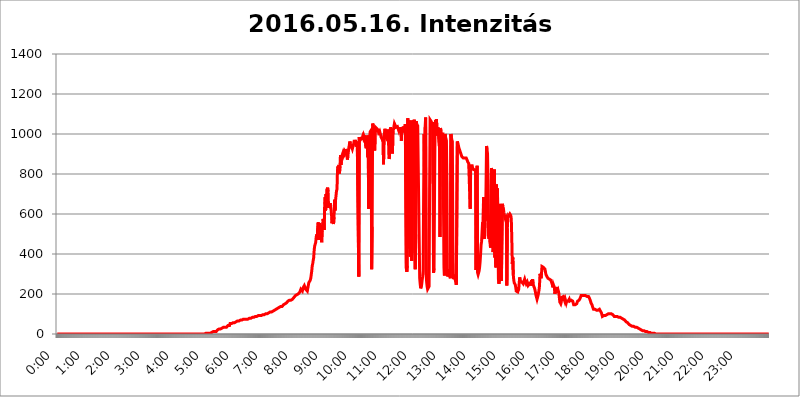
| Category | 2016.05.16. Intenzitás [W/m^2] |
|---|---|
| 0.0 | 0 |
| 0.0006944444444444445 | 0 |
| 0.001388888888888889 | 0 |
| 0.0020833333333333333 | 0 |
| 0.002777777777777778 | 0 |
| 0.003472222222222222 | 0 |
| 0.004166666666666667 | 0 |
| 0.004861111111111111 | 0 |
| 0.005555555555555556 | 0 |
| 0.0062499999999999995 | 0 |
| 0.006944444444444444 | 0 |
| 0.007638888888888889 | 0 |
| 0.008333333333333333 | 0 |
| 0.009027777777777779 | 0 |
| 0.009722222222222222 | 0 |
| 0.010416666666666666 | 0 |
| 0.011111111111111112 | 0 |
| 0.011805555555555555 | 0 |
| 0.012499999999999999 | 0 |
| 0.013194444444444444 | 0 |
| 0.013888888888888888 | 0 |
| 0.014583333333333332 | 0 |
| 0.015277777777777777 | 0 |
| 0.015972222222222224 | 0 |
| 0.016666666666666666 | 0 |
| 0.017361111111111112 | 0 |
| 0.018055555555555557 | 0 |
| 0.01875 | 0 |
| 0.019444444444444445 | 0 |
| 0.02013888888888889 | 0 |
| 0.020833333333333332 | 0 |
| 0.02152777777777778 | 0 |
| 0.022222222222222223 | 0 |
| 0.02291666666666667 | 0 |
| 0.02361111111111111 | 0 |
| 0.024305555555555556 | 0 |
| 0.024999999999999998 | 0 |
| 0.025694444444444447 | 0 |
| 0.02638888888888889 | 0 |
| 0.027083333333333334 | 0 |
| 0.027777777777777776 | 0 |
| 0.02847222222222222 | 0 |
| 0.029166666666666664 | 0 |
| 0.029861111111111113 | 0 |
| 0.030555555555555555 | 0 |
| 0.03125 | 0 |
| 0.03194444444444445 | 0 |
| 0.03263888888888889 | 0 |
| 0.03333333333333333 | 0 |
| 0.034027777777777775 | 0 |
| 0.034722222222222224 | 0 |
| 0.035416666666666666 | 0 |
| 0.036111111111111115 | 0 |
| 0.03680555555555556 | 0 |
| 0.0375 | 0 |
| 0.03819444444444444 | 0 |
| 0.03888888888888889 | 0 |
| 0.03958333333333333 | 0 |
| 0.04027777777777778 | 0 |
| 0.04097222222222222 | 0 |
| 0.041666666666666664 | 0 |
| 0.042361111111111106 | 0 |
| 0.04305555555555556 | 0 |
| 0.043750000000000004 | 0 |
| 0.044444444444444446 | 0 |
| 0.04513888888888889 | 0 |
| 0.04583333333333334 | 0 |
| 0.04652777777777778 | 0 |
| 0.04722222222222222 | 0 |
| 0.04791666666666666 | 0 |
| 0.04861111111111111 | 0 |
| 0.049305555555555554 | 0 |
| 0.049999999999999996 | 0 |
| 0.05069444444444445 | 0 |
| 0.051388888888888894 | 0 |
| 0.052083333333333336 | 0 |
| 0.05277777777777778 | 0 |
| 0.05347222222222222 | 0 |
| 0.05416666666666667 | 0 |
| 0.05486111111111111 | 0 |
| 0.05555555555555555 | 0 |
| 0.05625 | 0 |
| 0.05694444444444444 | 0 |
| 0.057638888888888885 | 0 |
| 0.05833333333333333 | 0 |
| 0.05902777777777778 | 0 |
| 0.059722222222222225 | 0 |
| 0.06041666666666667 | 0 |
| 0.061111111111111116 | 0 |
| 0.06180555555555556 | 0 |
| 0.0625 | 0 |
| 0.06319444444444444 | 0 |
| 0.06388888888888888 | 0 |
| 0.06458333333333334 | 0 |
| 0.06527777777777778 | 0 |
| 0.06597222222222222 | 0 |
| 0.06666666666666667 | 0 |
| 0.06736111111111111 | 0 |
| 0.06805555555555555 | 0 |
| 0.06874999999999999 | 0 |
| 0.06944444444444443 | 0 |
| 0.07013888888888889 | 0 |
| 0.07083333333333333 | 0 |
| 0.07152777777777779 | 0 |
| 0.07222222222222223 | 0 |
| 0.07291666666666667 | 0 |
| 0.07361111111111111 | 0 |
| 0.07430555555555556 | 0 |
| 0.075 | 0 |
| 0.07569444444444444 | 0 |
| 0.0763888888888889 | 0 |
| 0.07708333333333334 | 0 |
| 0.07777777777777778 | 0 |
| 0.07847222222222222 | 0 |
| 0.07916666666666666 | 0 |
| 0.0798611111111111 | 0 |
| 0.08055555555555556 | 0 |
| 0.08125 | 0 |
| 0.08194444444444444 | 0 |
| 0.08263888888888889 | 0 |
| 0.08333333333333333 | 0 |
| 0.08402777777777777 | 0 |
| 0.08472222222222221 | 0 |
| 0.08541666666666665 | 0 |
| 0.08611111111111112 | 0 |
| 0.08680555555555557 | 0 |
| 0.08750000000000001 | 0 |
| 0.08819444444444445 | 0 |
| 0.08888888888888889 | 0 |
| 0.08958333333333333 | 0 |
| 0.09027777777777778 | 0 |
| 0.09097222222222222 | 0 |
| 0.09166666666666667 | 0 |
| 0.09236111111111112 | 0 |
| 0.09305555555555556 | 0 |
| 0.09375 | 0 |
| 0.09444444444444444 | 0 |
| 0.09513888888888888 | 0 |
| 0.09583333333333333 | 0 |
| 0.09652777777777777 | 0 |
| 0.09722222222222222 | 0 |
| 0.09791666666666667 | 0 |
| 0.09861111111111111 | 0 |
| 0.09930555555555555 | 0 |
| 0.09999999999999999 | 0 |
| 0.10069444444444443 | 0 |
| 0.1013888888888889 | 0 |
| 0.10208333333333335 | 0 |
| 0.10277777777777779 | 0 |
| 0.10347222222222223 | 0 |
| 0.10416666666666667 | 0 |
| 0.10486111111111111 | 0 |
| 0.10555555555555556 | 0 |
| 0.10625 | 0 |
| 0.10694444444444444 | 0 |
| 0.1076388888888889 | 0 |
| 0.10833333333333334 | 0 |
| 0.10902777777777778 | 0 |
| 0.10972222222222222 | 0 |
| 0.1111111111111111 | 0 |
| 0.11180555555555556 | 0 |
| 0.11180555555555556 | 0 |
| 0.1125 | 0 |
| 0.11319444444444444 | 0 |
| 0.11388888888888889 | 0 |
| 0.11458333333333333 | 0 |
| 0.11527777777777777 | 0 |
| 0.11597222222222221 | 0 |
| 0.11666666666666665 | 0 |
| 0.1173611111111111 | 0 |
| 0.11805555555555557 | 0 |
| 0.11944444444444445 | 0 |
| 0.12013888888888889 | 0 |
| 0.12083333333333333 | 0 |
| 0.12152777777777778 | 0 |
| 0.12222222222222223 | 0 |
| 0.12291666666666667 | 0 |
| 0.12291666666666667 | 0 |
| 0.12361111111111112 | 0 |
| 0.12430555555555556 | 0 |
| 0.125 | 0 |
| 0.12569444444444444 | 0 |
| 0.12638888888888888 | 0 |
| 0.12708333333333333 | 0 |
| 0.16875 | 0 |
| 0.12847222222222224 | 0 |
| 0.12916666666666668 | 0 |
| 0.12986111111111112 | 0 |
| 0.13055555555555556 | 0 |
| 0.13125 | 0 |
| 0.13194444444444445 | 0 |
| 0.1326388888888889 | 0 |
| 0.13333333333333333 | 0 |
| 0.13402777777777777 | 0 |
| 0.13402777777777777 | 0 |
| 0.13472222222222222 | 0 |
| 0.13541666666666666 | 0 |
| 0.1361111111111111 | 0 |
| 0.13749999999999998 | 0 |
| 0.13819444444444443 | 0 |
| 0.1388888888888889 | 0 |
| 0.13958333333333334 | 0 |
| 0.14027777777777778 | 0 |
| 0.14097222222222222 | 0 |
| 0.14166666666666666 | 0 |
| 0.1423611111111111 | 0 |
| 0.14305555555555557 | 0 |
| 0.14375000000000002 | 0 |
| 0.14444444444444446 | 0 |
| 0.1451388888888889 | 0 |
| 0.1451388888888889 | 0 |
| 0.14652777777777778 | 0 |
| 0.14722222222222223 | 0 |
| 0.14791666666666667 | 0 |
| 0.1486111111111111 | 0 |
| 0.14930555555555555 | 0 |
| 0.15 | 0 |
| 0.15069444444444444 | 0 |
| 0.15138888888888888 | 0 |
| 0.15208333333333332 | 0 |
| 0.15277777777777776 | 0 |
| 0.15347222222222223 | 0 |
| 0.15416666666666667 | 0 |
| 0.15486111111111112 | 0 |
| 0.15555555555555556 | 0 |
| 0.15625 | 0 |
| 0.15694444444444444 | 0 |
| 0.15763888888888888 | 0 |
| 0.15833333333333333 | 0 |
| 0.15902777777777777 | 0 |
| 0.15972222222222224 | 0 |
| 0.16041666666666668 | 0 |
| 0.16111111111111112 | 0 |
| 0.16180555555555556 | 0 |
| 0.1625 | 0 |
| 0.16319444444444445 | 0 |
| 0.1638888888888889 | 0 |
| 0.16458333333333333 | 0 |
| 0.16527777777777777 | 0 |
| 0.16597222222222222 | 0 |
| 0.16666666666666666 | 0 |
| 0.1673611111111111 | 0 |
| 0.16805555555555554 | 0 |
| 0.16874999999999998 | 0 |
| 0.16944444444444443 | 0 |
| 0.17013888888888887 | 0 |
| 0.1708333333333333 | 0 |
| 0.17152777777777775 | 0 |
| 0.17222222222222225 | 0 |
| 0.1729166666666667 | 0 |
| 0.17361111111111113 | 0 |
| 0.17430555555555557 | 0 |
| 0.17500000000000002 | 0 |
| 0.17569444444444446 | 0 |
| 0.1763888888888889 | 0 |
| 0.17708333333333334 | 0 |
| 0.17777777777777778 | 0 |
| 0.17847222222222223 | 0 |
| 0.17916666666666667 | 0 |
| 0.1798611111111111 | 0 |
| 0.18055555555555555 | 0 |
| 0.18125 | 0 |
| 0.18194444444444444 | 0 |
| 0.1826388888888889 | 0 |
| 0.18333333333333335 | 0 |
| 0.1840277777777778 | 0 |
| 0.18472222222222223 | 0 |
| 0.18541666666666667 | 0 |
| 0.18611111111111112 | 0 |
| 0.18680555555555556 | 0 |
| 0.1875 | 0 |
| 0.18819444444444444 | 0 |
| 0.18888888888888888 | 0 |
| 0.18958333333333333 | 0 |
| 0.19027777777777777 | 0 |
| 0.1909722222222222 | 0 |
| 0.19166666666666665 | 0 |
| 0.19236111111111112 | 0 |
| 0.19305555555555554 | 0 |
| 0.19375 | 0 |
| 0.19444444444444445 | 0 |
| 0.1951388888888889 | 0 |
| 0.19583333333333333 | 0 |
| 0.19652777777777777 | 0 |
| 0.19722222222222222 | 0 |
| 0.19791666666666666 | 0 |
| 0.1986111111111111 | 0 |
| 0.19930555555555554 | 0 |
| 0.19999999999999998 | 0 |
| 0.20069444444444443 | 0 |
| 0.20138888888888887 | 0 |
| 0.2020833333333333 | 0 |
| 0.2027777777777778 | 0 |
| 0.2034722222222222 | 0 |
| 0.2041666666666667 | 0 |
| 0.20486111111111113 | 0 |
| 0.20555555555555557 | 0 |
| 0.20625000000000002 | 0 |
| 0.20694444444444446 | 0 |
| 0.2076388888888889 | 3.525 |
| 0.20833333333333334 | 3.525 |
| 0.20902777777777778 | 3.525 |
| 0.20972222222222223 | 3.525 |
| 0.21041666666666667 | 3.525 |
| 0.2111111111111111 | 3.525 |
| 0.21180555555555555 | 3.525 |
| 0.2125 | 3.525 |
| 0.21319444444444444 | 3.525 |
| 0.2138888888888889 | 3.525 |
| 0.21458333333333335 | 3.525 |
| 0.2152777777777778 | 7.887 |
| 0.21597222222222223 | 7.887 |
| 0.21666666666666667 | 7.887 |
| 0.21736111111111112 | 7.887 |
| 0.21805555555555556 | 7.887 |
| 0.21875 | 12.257 |
| 0.21944444444444444 | 12.257 |
| 0.22013888888888888 | 12.257 |
| 0.22083333333333333 | 12.257 |
| 0.22152777777777777 | 12.257 |
| 0.2222222222222222 | 12.257 |
| 0.22291666666666665 | 12.257 |
| 0.2236111111111111 | 16.636 |
| 0.22430555555555556 | 16.636 |
| 0.225 | 21.024 |
| 0.22569444444444445 | 21.024 |
| 0.2263888888888889 | 21.024 |
| 0.22708333333333333 | 25.419 |
| 0.22777777777777777 | 25.419 |
| 0.22847222222222222 | 25.419 |
| 0.22916666666666666 | 25.419 |
| 0.2298611111111111 | 25.419 |
| 0.23055555555555554 | 29.823 |
| 0.23124999999999998 | 29.823 |
| 0.23194444444444443 | 29.823 |
| 0.23263888888888887 | 34.234 |
| 0.2333333333333333 | 34.234 |
| 0.2340277777777778 | 34.234 |
| 0.2347222222222222 | 29.823 |
| 0.2354166666666667 | 34.234 |
| 0.23611111111111113 | 34.234 |
| 0.23680555555555557 | 34.234 |
| 0.23750000000000002 | 34.234 |
| 0.23819444444444446 | 38.653 |
| 0.2388888888888889 | 38.653 |
| 0.23958333333333334 | 43.079 |
| 0.24027777777777778 | 43.079 |
| 0.24097222222222223 | 43.079 |
| 0.24166666666666667 | 43.079 |
| 0.2423611111111111 | 51.951 |
| 0.24305555555555555 | 51.951 |
| 0.24375 | 51.951 |
| 0.24444444444444446 | 51.951 |
| 0.24513888888888888 | 56.398 |
| 0.24583333333333335 | 56.398 |
| 0.2465277777777778 | 56.398 |
| 0.24722222222222223 | 56.398 |
| 0.24791666666666667 | 56.398 |
| 0.24861111111111112 | 56.398 |
| 0.24930555555555556 | 60.85 |
| 0.25 | 60.85 |
| 0.25069444444444444 | 60.85 |
| 0.2513888888888889 | 60.85 |
| 0.2520833333333333 | 60.85 |
| 0.25277777777777777 | 65.31 |
| 0.2534722222222222 | 65.31 |
| 0.25416666666666665 | 65.31 |
| 0.2548611111111111 | 65.31 |
| 0.2555555555555556 | 65.31 |
| 0.25625000000000003 | 69.775 |
| 0.2569444444444445 | 69.775 |
| 0.2576388888888889 | 69.775 |
| 0.25833333333333336 | 69.775 |
| 0.2590277777777778 | 69.775 |
| 0.25972222222222224 | 74.246 |
| 0.2604166666666667 | 74.246 |
| 0.2611111111111111 | 74.246 |
| 0.26180555555555557 | 74.246 |
| 0.2625 | 74.246 |
| 0.26319444444444445 | 74.246 |
| 0.2638888888888889 | 74.246 |
| 0.26458333333333334 | 74.246 |
| 0.2652777777777778 | 74.246 |
| 0.2659722222222222 | 74.246 |
| 0.26666666666666666 | 74.246 |
| 0.2673611111111111 | 74.246 |
| 0.26805555555555555 | 78.722 |
| 0.26875 | 78.722 |
| 0.26944444444444443 | 78.722 |
| 0.2701388888888889 | 78.722 |
| 0.2708333333333333 | 78.722 |
| 0.27152777777777776 | 78.722 |
| 0.2722222222222222 | 83.205 |
| 0.27291666666666664 | 83.205 |
| 0.2736111111111111 | 83.205 |
| 0.2743055555555555 | 83.205 |
| 0.27499999999999997 | 83.205 |
| 0.27569444444444446 | 83.205 |
| 0.27638888888888885 | 83.205 |
| 0.27708333333333335 | 87.692 |
| 0.2777777777777778 | 87.692 |
| 0.27847222222222223 | 87.692 |
| 0.2791666666666667 | 87.692 |
| 0.2798611111111111 | 87.692 |
| 0.28055555555555556 | 87.692 |
| 0.28125 | 87.692 |
| 0.28194444444444444 | 92.184 |
| 0.2826388888888889 | 92.184 |
| 0.2833333333333333 | 92.184 |
| 0.28402777777777777 | 92.184 |
| 0.2847222222222222 | 92.184 |
| 0.28541666666666665 | 92.184 |
| 0.28611111111111115 | 92.184 |
| 0.28680555555555554 | 96.682 |
| 0.28750000000000003 | 96.682 |
| 0.2881944444444445 | 96.682 |
| 0.2888888888888889 | 96.682 |
| 0.28958333333333336 | 96.682 |
| 0.2902777777777778 | 96.682 |
| 0.29097222222222224 | 101.184 |
| 0.2916666666666667 | 101.184 |
| 0.2923611111111111 | 101.184 |
| 0.29305555555555557 | 101.184 |
| 0.29375 | 101.184 |
| 0.29444444444444445 | 101.184 |
| 0.2951388888888889 | 105.69 |
| 0.29583333333333334 | 105.69 |
| 0.2965277777777778 | 105.69 |
| 0.2972222222222222 | 105.69 |
| 0.29791666666666666 | 105.69 |
| 0.2986111111111111 | 110.201 |
| 0.29930555555555555 | 110.201 |
| 0.3 | 110.201 |
| 0.30069444444444443 | 110.201 |
| 0.3013888888888889 | 110.201 |
| 0.3020833333333333 | 110.201 |
| 0.30277777777777776 | 114.716 |
| 0.3034722222222222 | 114.716 |
| 0.30416666666666664 | 119.235 |
| 0.3048611111111111 | 119.235 |
| 0.3055555555555555 | 119.235 |
| 0.30624999999999997 | 123.758 |
| 0.3069444444444444 | 123.758 |
| 0.3076388888888889 | 128.284 |
| 0.30833333333333335 | 128.284 |
| 0.3090277777777778 | 128.284 |
| 0.30972222222222223 | 128.284 |
| 0.3104166666666667 | 132.814 |
| 0.3111111111111111 | 132.814 |
| 0.31180555555555556 | 132.814 |
| 0.3125 | 132.814 |
| 0.31319444444444444 | 137.347 |
| 0.3138888888888889 | 137.347 |
| 0.3145833333333333 | 137.347 |
| 0.31527777777777777 | 137.347 |
| 0.3159722222222222 | 137.347 |
| 0.31666666666666665 | 141.884 |
| 0.31736111111111115 | 146.423 |
| 0.31805555555555554 | 146.423 |
| 0.31875000000000003 | 150.964 |
| 0.3194444444444445 | 150.964 |
| 0.3201388888888889 | 150.964 |
| 0.32083333333333336 | 155.509 |
| 0.3215277777777778 | 155.509 |
| 0.32222222222222224 | 160.056 |
| 0.3229166666666667 | 160.056 |
| 0.3236111111111111 | 164.605 |
| 0.32430555555555557 | 164.605 |
| 0.325 | 164.605 |
| 0.32569444444444445 | 169.156 |
| 0.3263888888888889 | 169.156 |
| 0.32708333333333334 | 169.156 |
| 0.3277777777777778 | 169.156 |
| 0.3284722222222222 | 173.709 |
| 0.32916666666666666 | 173.709 |
| 0.3298611111111111 | 173.709 |
| 0.33055555555555555 | 178.264 |
| 0.33125 | 178.264 |
| 0.33194444444444443 | 182.82 |
| 0.3326388888888889 | 182.82 |
| 0.3333333333333333 | 187.378 |
| 0.3340277777777778 | 191.937 |
| 0.3347222222222222 | 191.937 |
| 0.3354166666666667 | 196.497 |
| 0.3361111111111111 | 196.497 |
| 0.3368055555555556 | 191.937 |
| 0.33749999999999997 | 196.497 |
| 0.33819444444444446 | 201.058 |
| 0.33888888888888885 | 201.058 |
| 0.33958333333333335 | 205.62 |
| 0.34027777777777773 | 210.182 |
| 0.34097222222222223 | 205.62 |
| 0.3416666666666666 | 223.873 |
| 0.3423611111111111 | 228.436 |
| 0.3430555555555555 | 228.436 |
| 0.34375 | 214.746 |
| 0.3444444444444445 | 219.309 |
| 0.3451388888888889 | 233 |
| 0.3458333333333334 | 233 |
| 0.34652777777777777 | 242.127 |
| 0.34722222222222227 | 242.127 |
| 0.34791666666666665 | 237.564 |
| 0.34861111111111115 | 223.873 |
| 0.34930555555555554 | 219.309 |
| 0.35000000000000003 | 228.436 |
| 0.3506944444444444 | 214.746 |
| 0.3513888888888889 | 228.436 |
| 0.3520833333333333 | 242.127 |
| 0.3527777777777778 | 255.813 |
| 0.3534722222222222 | 255.813 |
| 0.3541666666666667 | 255.813 |
| 0.3548611111111111 | 269.49 |
| 0.35555555555555557 | 278.603 |
| 0.35625 | 296.808 |
| 0.35694444444444445 | 314.98 |
| 0.3576388888888889 | 342.162 |
| 0.35833333333333334 | 351.198 |
| 0.3590277777777778 | 369.23 |
| 0.3597222222222222 | 382.715 |
| 0.36041666666666666 | 422.943 |
| 0.3611111111111111 | 440.702 |
| 0.36180555555555555 | 445.129 |
| 0.3625 | 458.38 |
| 0.36319444444444443 | 484.735 |
| 0.3638888888888889 | 497.836 |
| 0.3645833333333333 | 471.582 |
| 0.3652777777777778 | 528.2 |
| 0.3659722222222222 | 558.261 |
| 0.3666666666666667 | 471.582 |
| 0.3673611111111111 | 506.542 |
| 0.3680555555555556 | 553.986 |
| 0.36874999999999997 | 545.416 |
| 0.36944444444444446 | 519.555 |
| 0.37013888888888885 | 497.836 |
| 0.37083333333333335 | 458.38 |
| 0.37152777777777773 | 515.223 |
| 0.37222222222222223 | 545.416 |
| 0.3729166666666666 | 575.299 |
| 0.3736111111111111 | 553.986 |
| 0.3743055555555555 | 519.555 |
| 0.375 | 634.105 |
| 0.3756944444444445 | 683.473 |
| 0.3763888888888889 | 617.436 |
| 0.3770833333333334 | 699.717 |
| 0.37777777777777777 | 675.311 |
| 0.37847222222222227 | 723.889 |
| 0.37916666666666665 | 731.896 |
| 0.37986111111111115 | 711.832 |
| 0.38055555555555554 | 629.948 |
| 0.38125000000000003 | 650.667 |
| 0.3819444444444444 | 642.4 |
| 0.3826388888888889 | 654.791 |
| 0.3833333333333333 | 634.105 |
| 0.3840277777777778 | 621.613 |
| 0.3847222222222222 | 596.45 |
| 0.3854166666666667 | 553.986 |
| 0.3861111111111111 | 604.864 |
| 0.38680555555555557 | 571.049 |
| 0.3875 | 549.704 |
| 0.38819444444444445 | 583.779 |
| 0.3888888888888889 | 671.22 |
| 0.38958333333333334 | 617.436 |
| 0.3902777777777778 | 667.123 |
| 0.3909722222222222 | 671.22 |
| 0.39166666666666666 | 715.858 |
| 0.3923611111111111 | 723.889 |
| 0.39305555555555555 | 818.392 |
| 0.39375 | 837.682 |
| 0.39444444444444443 | 806.757 |
| 0.3951388888888889 | 845.365 |
| 0.3958333333333333 | 802.868 |
| 0.3965277777777778 | 837.682 |
| 0.3972222222222222 | 894.885 |
| 0.3979166666666667 | 845.365 |
| 0.3986111111111111 | 875.918 |
| 0.3993055555555556 | 891.099 |
| 0.39999999999999997 | 891.099 |
| 0.40069444444444446 | 906.223 |
| 0.40138888888888885 | 894.885 |
| 0.40208333333333335 | 891.099 |
| 0.40277777777777773 | 909.996 |
| 0.40347222222222223 | 902.447 |
| 0.4041666666666666 | 909.996 |
| 0.4048611111111111 | 925.06 |
| 0.4055555555555555 | 921.298 |
| 0.40625 | 898.668 |
| 0.4069444444444445 | 872.114 |
| 0.4076388888888889 | 891.099 |
| 0.4083333333333334 | 894.885 |
| 0.40902777777777777 | 932.576 |
| 0.40972222222222227 | 928.819 |
| 0.41041666666666665 | 962.555 |
| 0.41111111111111115 | 951.327 |
| 0.41180555555555554 | 928.819 |
| 0.41250000000000003 | 947.58 |
| 0.4131944444444444 | 932.576 |
| 0.4138888888888889 | 925.06 |
| 0.4145833333333333 | 928.819 |
| 0.4152777777777778 | 928.819 |
| 0.4159722222222222 | 955.071 |
| 0.4166666666666667 | 970.034 |
| 0.4173611111111111 | 962.555 |
| 0.41805555555555557 | 970.034 |
| 0.41875 | 955.071 |
| 0.41944444444444445 | 936.33 |
| 0.4201388888888889 | 951.327 |
| 0.42083333333333334 | 962.555 |
| 0.4215277777777778 | 962.555 |
| 0.4222222222222222 | 962.555 |
| 0.42291666666666666 | 287.709 |
| 0.4236111111111111 | 984.98 |
| 0.42430555555555555 | 966.295 |
| 0.425 | 970.034 |
| 0.42569444444444443 | 973.772 |
| 0.4263888888888889 | 970.034 |
| 0.4270833333333333 | 977.508 |
| 0.4277777777777778 | 981.244 |
| 0.4284722222222222 | 988.714 |
| 0.4291666666666667 | 981.244 |
| 0.4298611111111111 | 992.448 |
| 0.4305555555555556 | 984.98 |
| 0.43124999999999997 | 970.034 |
| 0.43194444444444446 | 992.448 |
| 0.43263888888888885 | 940.082 |
| 0.43333333333333335 | 928.819 |
| 0.43402777777777773 | 984.98 |
| 0.43472222222222223 | 970.034 |
| 0.4354166666666666 | 883.516 |
| 0.4361111111111111 | 992.448 |
| 0.4368055555555555 | 625.784 |
| 0.4375 | 845.365 |
| 0.4381944444444445 | 984.98 |
| 0.4388888888888889 | 1011.118 |
| 0.4395833333333334 | 1011.118 |
| 0.44027777777777777 | 1018.587 |
| 0.44097222222222227 | 324.052 |
| 0.44166666666666665 | 536.82 |
| 0.44236111111111115 | 1052.255 |
| 0.44305555555555554 | 1041.019 |
| 0.44375000000000003 | 1033.537 |
| 0.4444444444444444 | 999.916 |
| 0.4451388888888889 | 917.534 |
| 0.4458333333333333 | 981.244 |
| 0.4465277777777778 | 1033.537 |
| 0.4472222222222222 | 1029.798 |
| 0.4479166666666667 | 1033.537 |
| 0.4486111111111111 | 1026.06 |
| 0.44930555555555557 | 1022.323 |
| 0.45 | 1018.587 |
| 0.45069444444444445 | 1007.383 |
| 0.4513888888888889 | 1007.383 |
| 0.45208333333333334 | 1014.852 |
| 0.4527777777777778 | 1011.118 |
| 0.4534722222222222 | 996.182 |
| 0.45416666666666666 | 984.98 |
| 0.4548611111111111 | 984.98 |
| 0.45555555555555555 | 981.244 |
| 0.45625 | 970.034 |
| 0.45694444444444443 | 984.98 |
| 0.4576388888888889 | 849.199 |
| 0.4583333333333333 | 992.448 |
| 0.4590277777777778 | 992.448 |
| 0.4597222222222222 | 1026.06 |
| 0.4604166666666667 | 1007.383 |
| 0.4611111111111111 | 981.244 |
| 0.4618055555555556 | 977.508 |
| 0.46249999999999997 | 973.772 |
| 0.46319444444444446 | 999.916 |
| 0.46388888888888885 | 1022.323 |
| 0.46458333333333335 | 966.295 |
| 0.46527777777777773 | 875.918 |
| 0.46597222222222223 | 883.516 |
| 0.4666666666666666 | 999.916 |
| 0.4673611111111111 | 1033.537 |
| 0.4680555555555555 | 1029.798 |
| 0.46875 | 1029.798 |
| 0.4694444444444445 | 1003.65 |
| 0.4701388888888889 | 902.447 |
| 0.4708333333333334 | 1014.852 |
| 0.47152777777777777 | 1022.323 |
| 0.47222222222222227 | 1026.06 |
| 0.47291666666666665 | 1052.255 |
| 0.47361111111111115 | 1052.255 |
| 0.47430555555555554 | 1041.019 |
| 0.47500000000000003 | 1033.537 |
| 0.4756944444444444 | 1033.537 |
| 0.4763888888888889 | 1037.277 |
| 0.4770833333333333 | 1037.277 |
| 0.4777777777777778 | 1029.798 |
| 0.4784722222222222 | 1026.06 |
| 0.4791666666666667 | 1014.852 |
| 0.4798611111111111 | 1022.323 |
| 0.48055555555555557 | 1033.537 |
| 0.48125 | 1037.277 |
| 0.48194444444444445 | 1007.383 |
| 0.4826388888888889 | 966.295 |
| 0.48333333333333334 | 1033.537 |
| 0.4840277777777778 | 1022.323 |
| 0.4847222222222222 | 1007.383 |
| 0.48541666666666666 | 1037.277 |
| 0.4861111111111111 | 1041.019 |
| 0.48680555555555555 | 1037.277 |
| 0.4875 | 1014.852 |
| 0.48819444444444443 | 1048.508 |
| 0.4888888888888889 | 1044.762 |
| 0.4895833333333333 | 328.584 |
| 0.4902777777777778 | 310.44 |
| 0.4909722222222222 | 342.162 |
| 0.4916666666666667 | 1078.555 |
| 0.4923611111111111 | 440.702 |
| 0.4930555555555556 | 427.39 |
| 0.49374999999999997 | 1067.267 |
| 0.49444444444444446 | 1067.267 |
| 0.49513888888888885 | 387.202 |
| 0.49583333333333335 | 1048.508 |
| 0.49652777777777773 | 436.27 |
| 0.49722222222222223 | 364.728 |
| 0.4979166666666666 | 1067.267 |
| 0.4986111111111111 | 1048.508 |
| 0.4993055555555555 | 1052.255 |
| 0.5 | 1007.383 |
| 0.5006944444444444 | 1071.027 |
| 0.5013888888888889 | 405.108 |
| 0.5020833333333333 | 324.052 |
| 0.5027777777777778 | 497.836 |
| 0.5034722222222222 | 1063.51 |
| 0.5041666666666667 | 1048.508 |
| 0.5048611111111111 | 1044.762 |
| 0.5055555555555555 | 1041.019 |
| 0.50625 | 1037.277 |
| 0.5069444444444444 | 1037.277 |
| 0.5076388888888889 | 471.582 |
| 0.5083333333333333 | 278.603 |
| 0.5090277777777777 | 251.251 |
| 0.5097222222222222 | 228.436 |
| 0.5104166666666666 | 228.436 |
| 0.5111111111111112 | 246.689 |
| 0.5118055555555555 | 269.49 |
| 0.5125000000000001 | 287.709 |
| 0.5131944444444444 | 314.98 |
| 0.513888888888889 | 711.832 |
| 0.5145833333333333 | 999.916 |
| 0.5152777777777778 | 695.666 |
| 0.5159722222222222 | 1033.537 |
| 0.5166666666666667 | 1082.324 |
| 0.517361111111111 | 296.808 |
| 0.5180555555555556 | 260.373 |
| 0.5187499999999999 | 237.564 |
| 0.5194444444444445 | 223.873 |
| 0.5201388888888888 | 228.436 |
| 0.5208333333333334 | 228.436 |
| 0.5215277777777778 | 237.564 |
| 0.5222222222222223 | 731.896 |
| 0.5229166666666667 | 1071.027 |
| 0.5236111111111111 | 1067.267 |
| 0.5243055555555556 | 1063.51 |
| 0.525 | 1059.756 |
| 0.5256944444444445 | 1052.255 |
| 0.5263888888888889 | 1059.756 |
| 0.5270833333333333 | 751.803 |
| 0.5277777777777778 | 305.898 |
| 0.5284722222222222 | 328.584 |
| 0.5291666666666667 | 703.762 |
| 0.5298611111111111 | 1029.798 |
| 0.5305555555555556 | 1071.027 |
| 0.53125 | 1052.255 |
| 0.5319444444444444 | 1074.789 |
| 0.5326388888888889 | 992.448 |
| 0.5333333333333333 | 1014.852 |
| 0.5340277777777778 | 1033.537 |
| 0.5347222222222222 | 1029.798 |
| 0.5354166666666667 | 1029.798 |
| 0.5361111111111111 | 932.576 |
| 0.5368055555555555 | 484.735 |
| 0.5375 | 1029.798 |
| 0.5381944444444444 | 1014.852 |
| 0.5388888888888889 | 999.916 |
| 0.5395833333333333 | 996.182 |
| 0.5402777777777777 | 999.916 |
| 0.5409722222222222 | 999.916 |
| 0.5416666666666666 | 1003.65 |
| 0.5423611111111112 | 342.162 |
| 0.5430555555555555 | 292.259 |
| 0.5437500000000001 | 999.916 |
| 0.5444444444444444 | 984.98 |
| 0.545138888888889 | 977.508 |
| 0.5458333333333333 | 966.295 |
| 0.5465277777777778 | 755.766 |
| 0.5472222222222222 | 287.709 |
| 0.5479166666666667 | 296.808 |
| 0.548611111111111 | 324.052 |
| 0.5493055555555556 | 305.898 |
| 0.5499999999999999 | 324.052 |
| 0.5506944444444445 | 287.709 |
| 0.5513888888888888 | 278.603 |
| 0.5520833333333334 | 999.916 |
| 0.5527777777777778 | 984.98 |
| 0.5534722222222223 | 970.034 |
| 0.5541666666666667 | 962.555 |
| 0.5548611111111111 | 458.38 |
| 0.5555555555555556 | 274.047 |
| 0.55625 | 287.709 |
| 0.5569444444444445 | 296.808 |
| 0.5576388888888889 | 283.156 |
| 0.5583333333333333 | 278.603 |
| 0.5590277777777778 | 296.808 |
| 0.5597222222222222 | 246.689 |
| 0.5604166666666667 | 251.251 |
| 0.5611111111111111 | 962.555 |
| 0.5618055555555556 | 955.071 |
| 0.5625 | 943.832 |
| 0.5631944444444444 | 932.576 |
| 0.5638888888888889 | 925.06 |
| 0.5645833333333333 | 917.534 |
| 0.5652777777777778 | 909.996 |
| 0.5659722222222222 | 902.447 |
| 0.5666666666666667 | 898.668 |
| 0.5673611111111111 | 887.309 |
| 0.5680555555555555 | 883.516 |
| 0.56875 | 883.516 |
| 0.5694444444444444 | 879.719 |
| 0.5701388888888889 | 875.918 |
| 0.5708333333333333 | 875.918 |
| 0.5715277777777777 | 879.719 |
| 0.5722222222222222 | 883.516 |
| 0.5729166666666666 | 883.516 |
| 0.5736111111111112 | 879.719 |
| 0.5743055555555555 | 875.918 |
| 0.5750000000000001 | 868.305 |
| 0.5756944444444444 | 860.676 |
| 0.576388888888889 | 856.855 |
| 0.5770833333333333 | 853.029 |
| 0.5777777777777778 | 849.199 |
| 0.5784722222222222 | 856.855 |
| 0.5791666666666667 | 625.784 |
| 0.579861111111111 | 841.526 |
| 0.5805555555555556 | 837.682 |
| 0.5812499999999999 | 837.682 |
| 0.5819444444444445 | 841.526 |
| 0.5826388888888888 | 829.981 |
| 0.5833333333333334 | 829.981 |
| 0.5840277777777778 | 822.26 |
| 0.5847222222222223 | 822.26 |
| 0.5854166666666667 | 818.392 |
| 0.5861111111111111 | 818.392 |
| 0.5868055555555556 | 826.123 |
| 0.5875 | 319.517 |
| 0.5881944444444445 | 707.8 |
| 0.5888888888888889 | 841.526 |
| 0.5895833333333333 | 305.898 |
| 0.5902777777777778 | 296.808 |
| 0.5909722222222222 | 301.354 |
| 0.5916666666666667 | 314.98 |
| 0.5923611111111111 | 333.113 |
| 0.5930555555555556 | 360.221 |
| 0.59375 | 400.638 |
| 0.5944444444444444 | 445.129 |
| 0.5951388888888889 | 462.786 |
| 0.5958333333333333 | 510.885 |
| 0.5965277777777778 | 558.261 |
| 0.5972222222222222 | 506.542 |
| 0.5979166666666667 | 683.473 |
| 0.5986111111111111 | 484.735 |
| 0.5993055555555555 | 475.972 |
| 0.6 | 558.261 |
| 0.6006944444444444 | 571.049 |
| 0.6013888888888889 | 735.89 |
| 0.6020833333333333 | 940.082 |
| 0.6027777777777777 | 921.298 |
| 0.6034722222222222 | 902.447 |
| 0.6041666666666666 | 767.62 |
| 0.6048611111111112 | 493.475 |
| 0.6055555555555555 | 475.972 |
| 0.6062500000000001 | 592.233 |
| 0.6069444444444444 | 458.38 |
| 0.607638888888889 | 431.833 |
| 0.6083333333333333 | 431.833 |
| 0.6090277777777778 | 829.981 |
| 0.6097222222222222 | 806.757 |
| 0.6104166666666667 | 462.786 |
| 0.611111111111111 | 409.574 |
| 0.6118055555555556 | 422.943 |
| 0.6124999999999999 | 427.39 |
| 0.6131944444444445 | 822.26 |
| 0.6138888888888888 | 382.715 |
| 0.6145833333333334 | 480.356 |
| 0.6152777777777778 | 333.113 |
| 0.6159722222222223 | 747.834 |
| 0.6166666666666667 | 502.192 |
| 0.6173611111111111 | 727.896 |
| 0.6180555555555556 | 528.2 |
| 0.61875 | 274.047 |
| 0.6194444444444445 | 251.251 |
| 0.6201388888888889 | 274.047 |
| 0.6208333333333333 | 650.667 |
| 0.6215277777777778 | 296.808 |
| 0.6222222222222222 | 287.709 |
| 0.6229166666666667 | 264.932 |
| 0.6236111111111111 | 260.373 |
| 0.6243055555555556 | 650.667 |
| 0.625 | 638.256 |
| 0.6256944444444444 | 629.948 |
| 0.6263888888888889 | 609.062 |
| 0.6270833333333333 | 596.45 |
| 0.6277777777777778 | 583.779 |
| 0.6284722222222222 | 575.299 |
| 0.6291666666666667 | 575.299 |
| 0.6298611111111111 | 583.779 |
| 0.6305555555555555 | 242.127 |
| 0.63125 | 528.2 |
| 0.6319444444444444 | 583.779 |
| 0.6326388888888889 | 583.779 |
| 0.6333333333333333 | 592.233 |
| 0.6340277777777777 | 596.45 |
| 0.6347222222222222 | 600.661 |
| 0.6354166666666666 | 596.45 |
| 0.6361111111111112 | 592.233 |
| 0.6368055555555555 | 575.299 |
| 0.6375000000000001 | 480.356 |
| 0.6381944444444444 | 351.198 |
| 0.638888888888889 | 382.715 |
| 0.6395833333333333 | 296.808 |
| 0.6402777777777778 | 269.49 |
| 0.6409722222222222 | 255.813 |
| 0.6416666666666667 | 255.813 |
| 0.642361111111111 | 246.689 |
| 0.6430555555555556 | 233 |
| 0.6437499999999999 | 214.746 |
| 0.6444444444444445 | 210.182 |
| 0.6451388888888888 | 214.746 |
| 0.6458333333333334 | 210.182 |
| 0.6465277777777778 | 210.182 |
| 0.6472222222222223 | 223.873 |
| 0.6479166666666667 | 255.813 |
| 0.6486111111111111 | 283.156 |
| 0.6493055555555556 | 264.932 |
| 0.65 | 269.49 |
| 0.6506944444444445 | 264.932 |
| 0.6513888888888889 | 260.373 |
| 0.6520833333333333 | 260.373 |
| 0.6527777777777778 | 255.813 |
| 0.6534722222222222 | 251.251 |
| 0.6541666666666667 | 251.251 |
| 0.6548611111111111 | 255.813 |
| 0.6555555555555556 | 274.047 |
| 0.65625 | 264.932 |
| 0.6569444444444444 | 260.373 |
| 0.6576388888888889 | 251.251 |
| 0.6583333333333333 | 246.689 |
| 0.6590277777777778 | 260.373 |
| 0.6597222222222222 | 255.813 |
| 0.6604166666666667 | 242.127 |
| 0.6611111111111111 | 242.127 |
| 0.6618055555555555 | 246.689 |
| 0.6625 | 251.251 |
| 0.6631944444444444 | 260.373 |
| 0.6638888888888889 | 242.127 |
| 0.6645833333333333 | 242.127 |
| 0.6652777777777777 | 269.49 |
| 0.6659722222222222 | 260.373 |
| 0.6666666666666666 | 274.047 |
| 0.6673611111111111 | 251.251 |
| 0.6680555555555556 | 242.127 |
| 0.6687500000000001 | 237.564 |
| 0.6694444444444444 | 228.436 |
| 0.6701388888888888 | 219.309 |
| 0.6708333333333334 | 205.62 |
| 0.6715277777777778 | 191.937 |
| 0.6722222222222222 | 182.82 |
| 0.6729166666666666 | 173.709 |
| 0.6736111111111112 | 169.156 |
| 0.6743055555555556 | 191.937 |
| 0.6749999999999999 | 196.497 |
| 0.6756944444444444 | 219.309 |
| 0.6763888888888889 | 242.127 |
| 0.6770833333333334 | 301.354 |
| 0.6777777777777777 | 305.898 |
| 0.6784722222222223 | 278.603 |
| 0.6791666666666667 | 301.354 |
| 0.6798611111111111 | 337.639 |
| 0.6805555555555555 | 333.113 |
| 0.68125 | 333.113 |
| 0.6819444444444445 | 333.113 |
| 0.6826388888888889 | 333.113 |
| 0.6833333333333332 | 328.584 |
| 0.6840277777777778 | 324.052 |
| 0.6847222222222222 | 310.44 |
| 0.6854166666666667 | 296.808 |
| 0.686111111111111 | 292.259 |
| 0.6868055555555556 | 287.709 |
| 0.6875 | 283.156 |
| 0.6881944444444444 | 278.603 |
| 0.688888888888889 | 278.603 |
| 0.6895833333333333 | 274.047 |
| 0.6902777777777778 | 274.047 |
| 0.6909722222222222 | 274.047 |
| 0.6916666666666668 | 269.49 |
| 0.6923611111111111 | 269.49 |
| 0.6930555555555555 | 260.373 |
| 0.69375 | 260.373 |
| 0.6944444444444445 | 246.689 |
| 0.6951388888888889 | 233 |
| 0.6958333333333333 | 246.689 |
| 0.6965277777777777 | 242.127 |
| 0.6972222222222223 | 233 |
| 0.6979166666666666 | 201.058 |
| 0.6986111111111111 | 210.182 |
| 0.6993055555555556 | 228.436 |
| 0.7000000000000001 | 233 |
| 0.7006944444444444 | 233 |
| 0.7013888888888888 | 228.436 |
| 0.7020833333333334 | 205.62 |
| 0.7027777777777778 | 214.746 |
| 0.7034722222222222 | 205.62 |
| 0.7041666666666666 | 201.058 |
| 0.7048611111111112 | 160.056 |
| 0.7055555555555556 | 155.509 |
| 0.7062499999999999 | 150.964 |
| 0.7069444444444444 | 160.056 |
| 0.7076388888888889 | 182.82 |
| 0.7083333333333334 | 187.378 |
| 0.7090277777777777 | 182.82 |
| 0.7097222222222223 | 187.378 |
| 0.7104166666666667 | 187.378 |
| 0.7111111111111111 | 182.82 |
| 0.7118055555555555 | 164.605 |
| 0.7125 | 173.709 |
| 0.7131944444444445 | 169.156 |
| 0.7138888888888889 | 155.509 |
| 0.7145833333333332 | 164.605 |
| 0.7152777777777778 | 164.605 |
| 0.7159722222222222 | 169.156 |
| 0.7166666666666667 | 164.605 |
| 0.717361111111111 | 160.056 |
| 0.7180555555555556 | 173.709 |
| 0.71875 | 164.605 |
| 0.7194444444444444 | 164.605 |
| 0.720138888888889 | 164.605 |
| 0.7208333333333333 | 169.156 |
| 0.7215277777777778 | 173.709 |
| 0.7222222222222222 | 164.605 |
| 0.7229166666666668 | 164.605 |
| 0.7236111111111111 | 155.509 |
| 0.7243055555555555 | 146.423 |
| 0.725 | 146.423 |
| 0.7256944444444445 | 150.964 |
| 0.7263888888888889 | 146.423 |
| 0.7270833333333333 | 146.423 |
| 0.7277777777777777 | 146.423 |
| 0.7284722222222223 | 150.964 |
| 0.7291666666666666 | 155.509 |
| 0.7298611111111111 | 164.605 |
| 0.7305555555555556 | 164.605 |
| 0.7312500000000001 | 169.156 |
| 0.7319444444444444 | 169.156 |
| 0.7326388888888888 | 173.709 |
| 0.7333333333333334 | 178.264 |
| 0.7340277777777778 | 182.82 |
| 0.7347222222222222 | 191.937 |
| 0.7354166666666666 | 191.937 |
| 0.7361111111111112 | 191.937 |
| 0.7368055555555556 | 191.937 |
| 0.7374999999999999 | 196.497 |
| 0.7381944444444444 | 191.937 |
| 0.7388888888888889 | 191.937 |
| 0.7395833333333334 | 191.937 |
| 0.7402777777777777 | 191.937 |
| 0.7409722222222223 | 191.937 |
| 0.7416666666666667 | 191.937 |
| 0.7423611111111111 | 191.937 |
| 0.7430555555555555 | 187.378 |
| 0.74375 | 187.378 |
| 0.7444444444444445 | 187.378 |
| 0.7451388888888889 | 187.378 |
| 0.7458333333333332 | 182.82 |
| 0.7465277777777778 | 178.264 |
| 0.7472222222222222 | 173.709 |
| 0.7479166666666667 | 164.605 |
| 0.748611111111111 | 155.509 |
| 0.7493055555555556 | 150.964 |
| 0.75 | 146.423 |
| 0.7506944444444444 | 137.347 |
| 0.751388888888889 | 137.347 |
| 0.7520833333333333 | 123.758 |
| 0.7527777777777778 | 128.284 |
| 0.7534722222222222 | 123.758 |
| 0.7541666666666668 | 123.758 |
| 0.7548611111111111 | 123.758 |
| 0.7555555555555555 | 123.758 |
| 0.75625 | 119.235 |
| 0.7569444444444445 | 119.235 |
| 0.7576388888888889 | 119.235 |
| 0.7583333333333333 | 119.235 |
| 0.7590277777777777 | 119.235 |
| 0.7597222222222223 | 119.235 |
| 0.7604166666666666 | 123.758 |
| 0.7611111111111111 | 119.235 |
| 0.7618055555555556 | 114.716 |
| 0.7625000000000001 | 110.201 |
| 0.7631944444444444 | 105.69 |
| 0.7638888888888888 | 96.682 |
| 0.7645833333333334 | 87.692 |
| 0.7652777777777778 | 92.184 |
| 0.7659722222222222 | 87.692 |
| 0.7666666666666666 | 92.184 |
| 0.7673611111111112 | 92.184 |
| 0.7680555555555556 | 87.692 |
| 0.7687499999999999 | 92.184 |
| 0.7694444444444444 | 92.184 |
| 0.7701388888888889 | 96.682 |
| 0.7708333333333334 | 96.682 |
| 0.7715277777777777 | 101.184 |
| 0.7722222222222223 | 101.184 |
| 0.7729166666666667 | 101.184 |
| 0.7736111111111111 | 105.69 |
| 0.7743055555555555 | 105.69 |
| 0.775 | 101.184 |
| 0.7756944444444445 | 105.69 |
| 0.7763888888888889 | 101.184 |
| 0.7770833333333332 | 101.184 |
| 0.7777777777777778 | 101.184 |
| 0.7784722222222222 | 101.184 |
| 0.7791666666666667 | 96.682 |
| 0.779861111111111 | 96.682 |
| 0.7805555555555556 | 92.184 |
| 0.78125 | 87.692 |
| 0.7819444444444444 | 92.184 |
| 0.782638888888889 | 92.184 |
| 0.7833333333333333 | 87.692 |
| 0.7840277777777778 | 87.692 |
| 0.7847222222222222 | 87.692 |
| 0.7854166666666668 | 87.692 |
| 0.7861111111111111 | 87.692 |
| 0.7868055555555555 | 87.692 |
| 0.7875 | 83.205 |
| 0.7881944444444445 | 87.692 |
| 0.7888888888888889 | 83.205 |
| 0.7895833333333333 | 83.205 |
| 0.7902777777777777 | 83.205 |
| 0.7909722222222223 | 83.205 |
| 0.7916666666666666 | 78.722 |
| 0.7923611111111111 | 78.722 |
| 0.7930555555555556 | 78.722 |
| 0.7937500000000001 | 74.246 |
| 0.7944444444444444 | 74.246 |
| 0.7951388888888888 | 69.775 |
| 0.7958333333333334 | 69.775 |
| 0.7965277777777778 | 65.31 |
| 0.7972222222222222 | 65.31 |
| 0.7979166666666666 | 60.85 |
| 0.7986111111111112 | 60.85 |
| 0.7993055555555556 | 56.398 |
| 0.7999999999999999 | 56.398 |
| 0.8006944444444444 | 51.951 |
| 0.8013888888888889 | 51.951 |
| 0.8020833333333334 | 47.511 |
| 0.8027777777777777 | 47.511 |
| 0.8034722222222223 | 47.511 |
| 0.8041666666666667 | 43.079 |
| 0.8048611111111111 | 43.079 |
| 0.8055555555555555 | 43.079 |
| 0.80625 | 38.653 |
| 0.8069444444444445 | 38.653 |
| 0.8076388888888889 | 38.653 |
| 0.8083333333333332 | 38.653 |
| 0.8090277777777778 | 38.653 |
| 0.8097222222222222 | 38.653 |
| 0.8104166666666667 | 34.234 |
| 0.811111111111111 | 34.234 |
| 0.8118055555555556 | 34.234 |
| 0.8125 | 34.234 |
| 0.8131944444444444 | 29.823 |
| 0.813888888888889 | 29.823 |
| 0.8145833333333333 | 29.823 |
| 0.8152777777777778 | 29.823 |
| 0.8159722222222222 | 29.823 |
| 0.8166666666666668 | 25.419 |
| 0.8173611111111111 | 25.419 |
| 0.8180555555555555 | 25.419 |
| 0.81875 | 21.024 |
| 0.8194444444444445 | 21.024 |
| 0.8201388888888889 | 21.024 |
| 0.8208333333333333 | 16.636 |
| 0.8215277777777777 | 16.636 |
| 0.8222222222222223 | 16.636 |
| 0.8229166666666666 | 16.636 |
| 0.8236111111111111 | 12.257 |
| 0.8243055555555556 | 12.257 |
| 0.8250000000000001 | 12.257 |
| 0.8256944444444444 | 12.257 |
| 0.8263888888888888 | 12.257 |
| 0.8270833333333334 | 12.257 |
| 0.8277777777777778 | 7.887 |
| 0.8284722222222222 | 7.887 |
| 0.8291666666666666 | 7.887 |
| 0.8298611111111112 | 7.887 |
| 0.8305555555555556 | 7.887 |
| 0.8312499999999999 | 7.887 |
| 0.8319444444444444 | 3.525 |
| 0.8326388888888889 | 3.525 |
| 0.8333333333333334 | 3.525 |
| 0.8340277777777777 | 3.525 |
| 0.8347222222222223 | 3.525 |
| 0.8354166666666667 | 3.525 |
| 0.8361111111111111 | 3.525 |
| 0.8368055555555555 | 3.525 |
| 0.8375 | 3.525 |
| 0.8381944444444445 | 0 |
| 0.8388888888888889 | 0 |
| 0.8395833333333332 | 0 |
| 0.8402777777777778 | 0 |
| 0.8409722222222222 | 0 |
| 0.8416666666666667 | 0 |
| 0.842361111111111 | 0 |
| 0.8430555555555556 | 0 |
| 0.84375 | 0 |
| 0.8444444444444444 | 0 |
| 0.845138888888889 | 0 |
| 0.8458333333333333 | 0 |
| 0.8465277777777778 | 0 |
| 0.8472222222222222 | 0 |
| 0.8479166666666668 | 0 |
| 0.8486111111111111 | 0 |
| 0.8493055555555555 | 0 |
| 0.85 | 0 |
| 0.8506944444444445 | 0 |
| 0.8513888888888889 | 0 |
| 0.8520833333333333 | 0 |
| 0.8527777777777777 | 0 |
| 0.8534722222222223 | 0 |
| 0.8541666666666666 | 0 |
| 0.8548611111111111 | 0 |
| 0.8555555555555556 | 0 |
| 0.8562500000000001 | 0 |
| 0.8569444444444444 | 0 |
| 0.8576388888888888 | 0 |
| 0.8583333333333334 | 0 |
| 0.8590277777777778 | 0 |
| 0.8597222222222222 | 0 |
| 0.8604166666666666 | 0 |
| 0.8611111111111112 | 0 |
| 0.8618055555555556 | 0 |
| 0.8624999999999999 | 0 |
| 0.8631944444444444 | 0 |
| 0.8638888888888889 | 0 |
| 0.8645833333333334 | 0 |
| 0.8652777777777777 | 0 |
| 0.8659722222222223 | 0 |
| 0.8666666666666667 | 0 |
| 0.8673611111111111 | 0 |
| 0.8680555555555555 | 0 |
| 0.86875 | 0 |
| 0.8694444444444445 | 0 |
| 0.8701388888888889 | 0 |
| 0.8708333333333332 | 0 |
| 0.8715277777777778 | 0 |
| 0.8722222222222222 | 0 |
| 0.8729166666666667 | 0 |
| 0.873611111111111 | 0 |
| 0.8743055555555556 | 0 |
| 0.875 | 0 |
| 0.8756944444444444 | 0 |
| 0.876388888888889 | 0 |
| 0.8770833333333333 | 0 |
| 0.8777777777777778 | 0 |
| 0.8784722222222222 | 0 |
| 0.8791666666666668 | 0 |
| 0.8798611111111111 | 0 |
| 0.8805555555555555 | 0 |
| 0.88125 | 0 |
| 0.8819444444444445 | 0 |
| 0.8826388888888889 | 0 |
| 0.8833333333333333 | 0 |
| 0.8840277777777777 | 0 |
| 0.8847222222222223 | 0 |
| 0.8854166666666666 | 0 |
| 0.8861111111111111 | 0 |
| 0.8868055555555556 | 0 |
| 0.8875000000000001 | 0 |
| 0.8881944444444444 | 0 |
| 0.8888888888888888 | 0 |
| 0.8895833333333334 | 0 |
| 0.8902777777777778 | 0 |
| 0.8909722222222222 | 0 |
| 0.8916666666666666 | 0 |
| 0.8923611111111112 | 0 |
| 0.8930555555555556 | 0 |
| 0.8937499999999999 | 0 |
| 0.8944444444444444 | 0 |
| 0.8951388888888889 | 0 |
| 0.8958333333333334 | 0 |
| 0.8965277777777777 | 0 |
| 0.8972222222222223 | 0 |
| 0.8979166666666667 | 0 |
| 0.8986111111111111 | 0 |
| 0.8993055555555555 | 0 |
| 0.9 | 0 |
| 0.9006944444444445 | 0 |
| 0.9013888888888889 | 0 |
| 0.9020833333333332 | 0 |
| 0.9027777777777778 | 0 |
| 0.9034722222222222 | 0 |
| 0.9041666666666667 | 0 |
| 0.904861111111111 | 0 |
| 0.9055555555555556 | 0 |
| 0.90625 | 0 |
| 0.9069444444444444 | 0 |
| 0.907638888888889 | 0 |
| 0.9083333333333333 | 0 |
| 0.9090277777777778 | 0 |
| 0.9097222222222222 | 0 |
| 0.9104166666666668 | 0 |
| 0.9111111111111111 | 0 |
| 0.9118055555555555 | 0 |
| 0.9125 | 0 |
| 0.9131944444444445 | 0 |
| 0.9138888888888889 | 0 |
| 0.9145833333333333 | 0 |
| 0.9152777777777777 | 0 |
| 0.9159722222222223 | 0 |
| 0.9166666666666666 | 0 |
| 0.9173611111111111 | 0 |
| 0.9180555555555556 | 0 |
| 0.9187500000000001 | 0 |
| 0.9194444444444444 | 0 |
| 0.9201388888888888 | 0 |
| 0.9208333333333334 | 0 |
| 0.9215277777777778 | 0 |
| 0.9222222222222222 | 0 |
| 0.9229166666666666 | 0 |
| 0.9236111111111112 | 0 |
| 0.9243055555555556 | 0 |
| 0.9249999999999999 | 0 |
| 0.9256944444444444 | 0 |
| 0.9263888888888889 | 0 |
| 0.9270833333333334 | 0 |
| 0.9277777777777777 | 0 |
| 0.9284722222222223 | 0 |
| 0.9291666666666667 | 0 |
| 0.9298611111111111 | 0 |
| 0.9305555555555555 | 0 |
| 0.93125 | 0 |
| 0.9319444444444445 | 0 |
| 0.9326388888888889 | 0 |
| 0.9333333333333332 | 0 |
| 0.9340277777777778 | 0 |
| 0.9347222222222222 | 0 |
| 0.9354166666666667 | 0 |
| 0.936111111111111 | 0 |
| 0.9368055555555556 | 0 |
| 0.9375 | 0 |
| 0.9381944444444444 | 0 |
| 0.938888888888889 | 0 |
| 0.9395833333333333 | 0 |
| 0.9402777777777778 | 0 |
| 0.9409722222222222 | 0 |
| 0.9416666666666668 | 0 |
| 0.9423611111111111 | 0 |
| 0.9430555555555555 | 0 |
| 0.94375 | 0 |
| 0.9444444444444445 | 0 |
| 0.9451388888888889 | 0 |
| 0.9458333333333333 | 0 |
| 0.9465277777777777 | 0 |
| 0.9472222222222223 | 0 |
| 0.9479166666666666 | 0 |
| 0.9486111111111111 | 0 |
| 0.9493055555555556 | 0 |
| 0.9500000000000001 | 0 |
| 0.9506944444444444 | 0 |
| 0.9513888888888888 | 0 |
| 0.9520833333333334 | 0 |
| 0.9527777777777778 | 0 |
| 0.9534722222222222 | 0 |
| 0.9541666666666666 | 0 |
| 0.9548611111111112 | 0 |
| 0.9555555555555556 | 0 |
| 0.9562499999999999 | 0 |
| 0.9569444444444444 | 0 |
| 0.9576388888888889 | 0 |
| 0.9583333333333334 | 0 |
| 0.9590277777777777 | 0 |
| 0.9597222222222223 | 0 |
| 0.9604166666666667 | 0 |
| 0.9611111111111111 | 0 |
| 0.9618055555555555 | 0 |
| 0.9625 | 0 |
| 0.9631944444444445 | 0 |
| 0.9638888888888889 | 0 |
| 0.9645833333333332 | 0 |
| 0.9652777777777778 | 0 |
| 0.9659722222222222 | 0 |
| 0.9666666666666667 | 0 |
| 0.967361111111111 | 0 |
| 0.9680555555555556 | 0 |
| 0.96875 | 0 |
| 0.9694444444444444 | 0 |
| 0.970138888888889 | 0 |
| 0.9708333333333333 | 0 |
| 0.9715277777777778 | 0 |
| 0.9722222222222222 | 0 |
| 0.9729166666666668 | 0 |
| 0.9736111111111111 | 0 |
| 0.9743055555555555 | 0 |
| 0.975 | 0 |
| 0.9756944444444445 | 0 |
| 0.9763888888888889 | 0 |
| 0.9770833333333333 | 0 |
| 0.9777777777777777 | 0 |
| 0.9784722222222223 | 0 |
| 0.9791666666666666 | 0 |
| 0.9798611111111111 | 0 |
| 0.9805555555555556 | 0 |
| 0.9812500000000001 | 0 |
| 0.9819444444444444 | 0 |
| 0.9826388888888888 | 0 |
| 0.9833333333333334 | 0 |
| 0.9840277777777778 | 0 |
| 0.9847222222222222 | 0 |
| 0.9854166666666666 | 0 |
| 0.9861111111111112 | 0 |
| 0.9868055555555556 | 0 |
| 0.9874999999999999 | 0 |
| 0.9881944444444444 | 0 |
| 0.9888888888888889 | 0 |
| 0.9895833333333334 | 0 |
| 0.9902777777777777 | 0 |
| 0.9909722222222223 | 0 |
| 0.9916666666666667 | 0 |
| 0.9923611111111111 | 0 |
| 0.9930555555555555 | 0 |
| 0.99375 | 0 |
| 0.9944444444444445 | 0 |
| 0.9951388888888889 | 0 |
| 0.9958333333333332 | 0 |
| 0.9965277777777778 | 0 |
| 0.9972222222222222 | 0 |
| 0.9979166666666667 | 0 |
| 0.998611111111111 | 0 |
| 0.9993055555555556 | 0 |